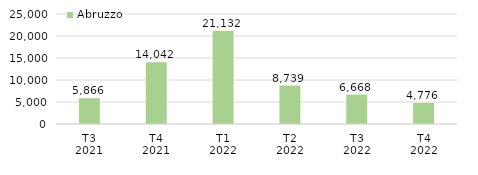
| Category | Abruzzo |
|---|---|
| T3
2021 | 5865.63 |
| T4
2021 | 14042.38 |
| T1
2022 | 21131.544 |
| T2
2022 | 8739.033 |
| T3
2022 | 6667.859 |
| T4
2022 | 4776.152 |